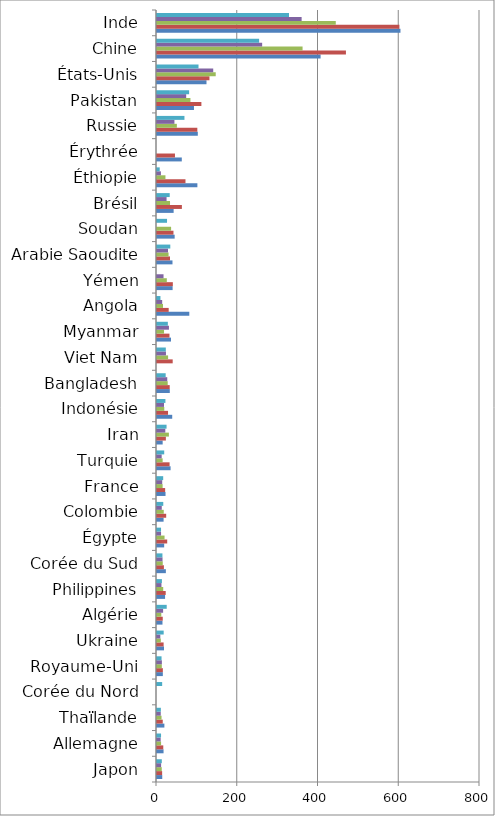
| Category | Series 0 | Series 1 | Series 2 | Series 3 | Series 4 |
|---|---|---|---|---|---|
| Japon | 13.01 | 12.714 | 11.771 | 10.158 | 11.909 |
| Allemagne | 16.225 | 15.543 | 10.113 | 9.102 | 10.004 |
| Thaïlande | 18.283 | 14.264 | 11.231 | 9.289 | 9.571 |
| Corée du Nord | 0 | 0 | 0 | 0 | 12.79 |
| Royaume-Uni | 14.453 | 14.493 | 11.926 | 12.079 | 11.254 |
| Ukraine | 17.401 | 16.389 | 9.457 | 8.201 | 16.543 |
| Algérie | 13.56 | 14.276 | 10.655 | 15.148 | 24.055 |
| Philippines | 19.993 | 21.57 | 15.405 | 11.024 | 12.17 |
| Corée du Sud | 21.954 | 17.099 | 14.245 | 13.672 | 13.461 |
| Égypte | 17.768 | 25.292 | 18.706 | 10.027 | 10 |
| Colombie | 16.32 | 22.749 | 16.734 | 11.822 | 15.535 |
| France | 21.131 | 20.189 | 13.946 | 12.904 | 15.346 |
| Turquie | 33.66 | 31.171 | 13.978 | 11.57 | 17.862 |
| Iran | 14.024 | 21.967 | 29.46 | 20.57 | 23.681 |
| Indonésie | 37.694 | 27.326 | 18.025 | 17.397 | 20.869 |
| Bangladesh | 31.7 | 31.478 | 26.5 | 25.391 | 21.502 |
| Viet Nam | 0 | 38.861 | 27.501 | 22.17 | 21.822 |
| Myanmar | 34.634 | 30.893 | 17.422 | 29.574 | 26.858 |
| Angola | 80.012 | 28.958 | 14.919 | 12.853 | 8.545 |
| Yémen | 38.676 | 39.24 | 24.311 | 16.165 | 0 |
| Arabie Saoudite | 38.355 | 32.258 | 28.625 | 27.284 | 32.918 |
| Soudan | 43.743 | 40.795 | 34.919 | 0 | 24.846 |
| Brésil | 41.194 | 61.646 | 32.277 | 23.701 | 31.509 |
| Éthiopie | 100.022 | 70.539 | 20.929 | 9.683 | 6.726 |
| Érythrée | 61.422 | 44.504 | 0 | 0 | 0 |
| Russie | 101.078 | 99.866 | 49.165 | 43.156 | 68.003 |
| Pakistan | 91.559 | 109.94 | 82.782 | 72.285 | 79.602 |
| États-Unis | 122.578 | 129.903 | 145.453 | 139.254 | 102.817 |
| Chine | 405.187 | 467.944 | 360.553 | 260.441 | 252.933 |
| Inde | 603.025 | 600.395 | 442.792 | 358.211 | 326.941 |